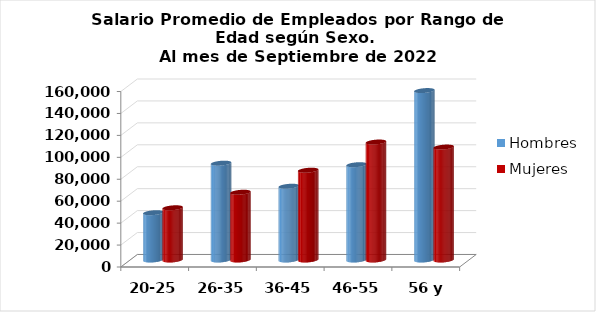
| Category | Hombres | Mujeres |
|---|---|---|
| 20-25 | 43127.273 | 47609.118 |
| 26-35 | 88288.758 | 61776.349 |
| 36-45 | 67258.132 | 81868.956 |
| 46-55 | 86897.917 | 107558.542 |
| 56 y más | 154479.545 | 102971.52 |